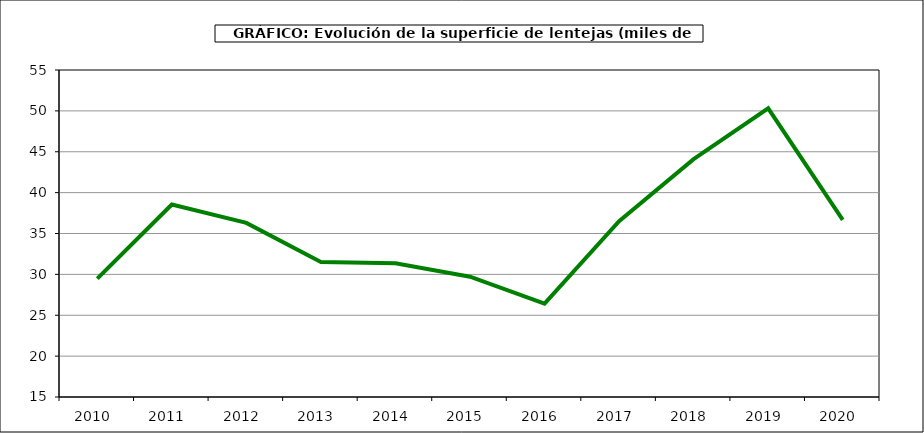
| Category | Superficie |
|---|---|
| 2010.0 | 29.478 |
| 2011.0 | 38.55 |
| 2012.0 | 36.298 |
| 2013.0 | 31.506 |
| 2014.0 | 31.35 |
| 2015.0 | 29.72 |
| 2016.0 | 26.427 |
| 2017.0 | 36.504 |
| 2018.0 | 44.101 |
| 2019.0 | 50.318 |
| 2020.0 | 36.667 |